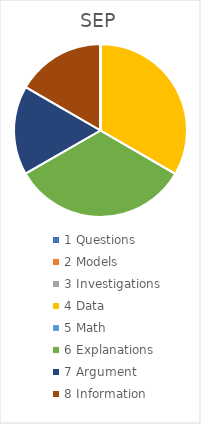
| Category | SEP |
|---|---|
| 1 Questions | 0 |
| 2 Models | 0 |
| 3 Investigations | 0 |
| 4 Data | 0.333 |
| 5 Math | 0 |
| 6 Explanations | 0.333 |
| 7 Argument | 0.167 |
| 8 Information | 0.167 |